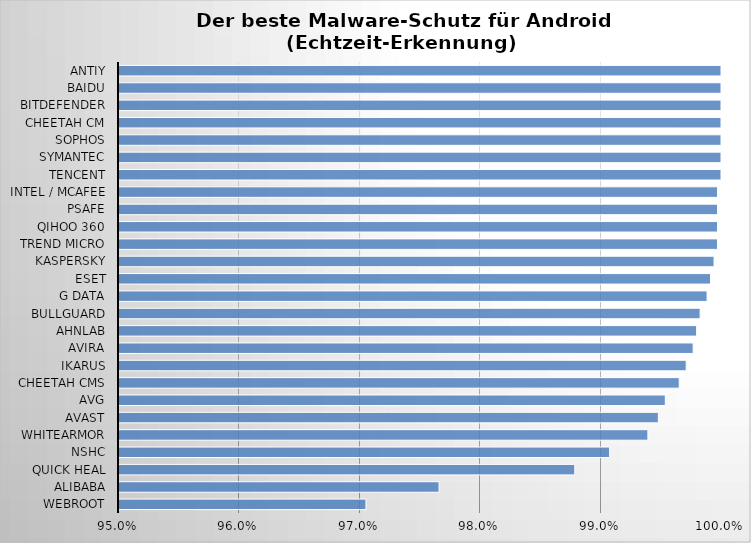
| Category | Series 0 |
|---|---|
| Webroot | 0.971 |
| Alibaba | 0.977 |
| Quick Heal | 0.988 |
| NSHC | 0.991 |
| WhiteArmor | 0.994 |
| Avast | 0.995 |
| AVG | 0.995 |
| Cheetah CMS | 0.997 |
| Ikarus | 0.997 |
| Avira | 0.998 |
| AhnLab | 0.998 |
| BullGuard | 0.998 |
| G Data | 0.999 |
| ESET | 0.999 |
| Kaspersky | 0.999 |
| Trend Micro | 1 |
| Qihoo 360 | 1 |
| PSafe | 1 |
| Intel / McAfee | 1 |
| Tencent | 1 |
| Symantec | 1 |
| Sophos | 1 |
| Cheetah CM | 1 |
| Bitdefender | 1 |
| Baidu | 1 |
| Antiy | 1 |